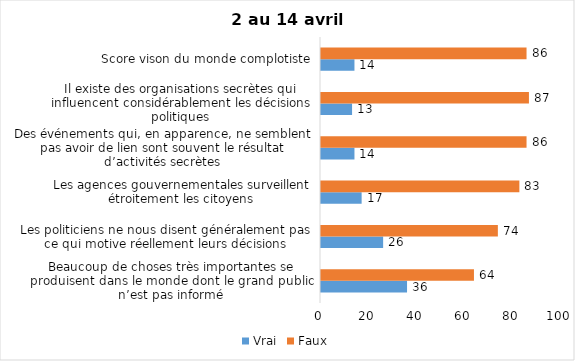
| Category | Vrai | Faux |
|---|---|---|
| Beaucoup de choses très importantes se produisent dans le monde dont le grand public n’est pas informé | 36 | 64 |
| Les politiciens ne nous disent généralement pas ce qui motive réellement leurs décisions | 26 | 74 |
| Les agences gouvernementales surveillent étroitement les citoyens | 17 | 83 |
| Des événements qui, en apparence, ne semblent pas avoir de lien sont souvent le résultat d’activités secrètes | 14 | 86 |
| Il existe des organisations secrètes qui influencent considérablement les décisions politiques | 13 | 87 |
| Score vison du monde complotiste | 14 | 86 |